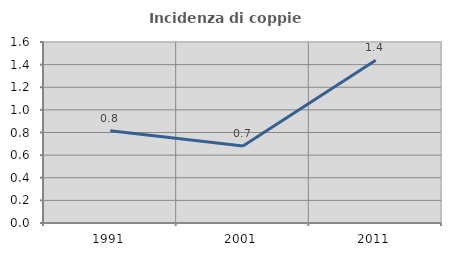
| Category | Incidenza di coppie miste |
|---|---|
| 1991.0 | 0.816 |
| 2001.0 | 0.68 |
| 2011.0 | 1.439 |